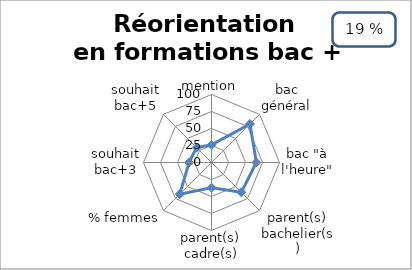
| Category | Réorientation en formations bac + 2  |
|---|---|
| mention | 26 |
| bac général | 80 |
| bac "à l'heure" | 66 |
| parent(s) bachelier(s) | 62 |
| parent(s) cadre(s) | 37 |
| % femmes | 66 |
| souhait bac+3 | 33 |
| souhait bac+5 | 31 |